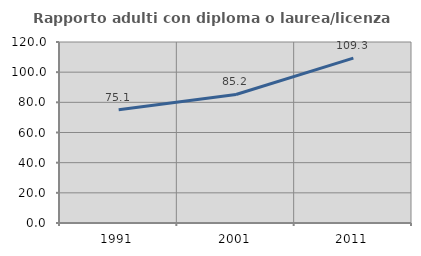
| Category | Rapporto adulti con diploma o laurea/licenza media  |
|---|---|
| 1991.0 | 75.149 |
| 2001.0 | 85.202 |
| 2011.0 | 109.267 |